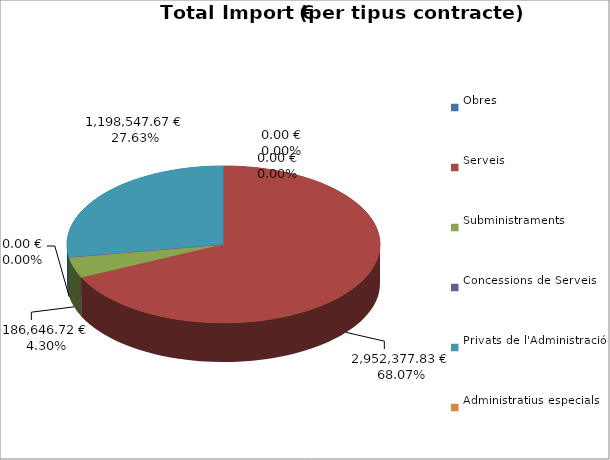
| Category | Total preu
(amb IVA) |
|---|---|
| Obres | 0 |
| Serveis | 2952377.83 |
| Subministraments | 186646.72 |
| Concessions de Serveis | 0 |
| Privats de l'Administració | 1198547.67 |
| Administratius especials | 0 |